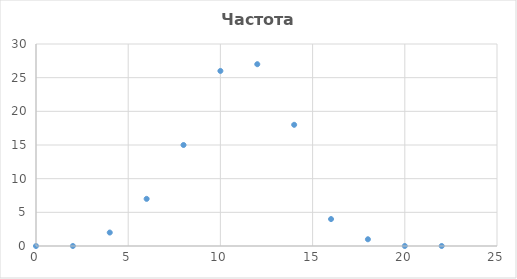
| Category | Series 0 |
|---|---|
| 0.0 | 0 |
| 2.0 | 0 |
| 4.0 | 2 |
| 6.0 | 7 |
| 8.0 | 15 |
| 10.0 | 26 |
| 12.0 | 27 |
| 14.0 | 18 |
| 16.0 | 4 |
| 18.0 | 1 |
| 20.0 | 0 |
| 22.0 | 0 |